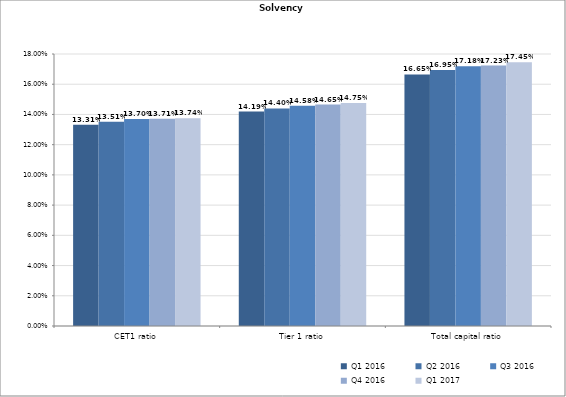
| Category | Q1 2016 | Q2 2016 | Q3 2016 | Q4 2016 | Q1 2017 |
|---|---|---|---|---|---|
| CET1 ratio | 0.133 | 0.135 | 0.137 | 0.137 | 0.137 |
| Tier 1 ratio | 0.142 | 0.144 | 0.146 | 0.147 | 0.148 |
| Total capital ratio | 0.167 | 0.169 | 0.172 | 0.172 | 0.174 |